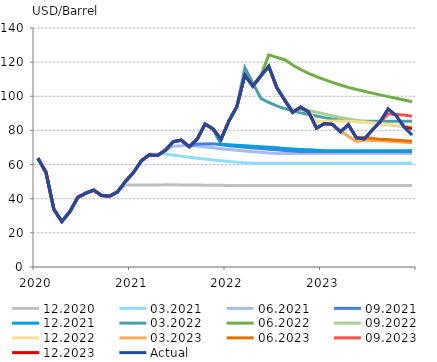
| Category | 12.2020 | 03.2021 | 06.2021 | 09.2021 | 12.2021 | 03.2022 | 06.2022 | 09.2022 | 12.2022 | 03.2023 | 06.2023 | 09.2023 | 12.2023 | Actual |
|---|---|---|---|---|---|---|---|---|---|---|---|---|---|---|
| 2020.0 | 63.673 | 63.673 | 63.673 | 63.673 | 63.673 | 63.673 | 63.673 | 63.673 | 63.673 | 63.673 | 63.673 | 63.673 | 63.673 | 63.673 |
| nan | 55.478 | 55.478 | 55.478 | 55.478 | 55.478 | 55.478 | 55.478 | 55.478 | 55.478 | 55.478 | 55.478 | 55.478 | 55.478 | 55.478 |
| nan | 33.729 | 33.729 | 33.729 | 33.729 | 33.729 | 33.729 | 33.729 | 33.729 | 33.729 | 33.729 | 33.729 | 33.729 | 33.729 | 33.729 |
| nan | 26.631 | 26.631 | 26.631 | 26.631 | 26.631 | 26.631 | 26.631 | 26.631 | 26.631 | 26.631 | 26.631 | 26.631 | 26.631 | 26.631 |
| nan | 32.412 | 32.412 | 32.412 | 32.412 | 32.412 | 32.412 | 32.412 | 32.412 | 32.412 | 32.412 | 32.412 | 32.412 | 32.412 | 32.412 |
| nan | 40.773 | 40.773 | 40.773 | 40.773 | 40.773 | 40.773 | 40.773 | 40.773 | 40.773 | 40.773 | 40.773 | 40.773 | 40.773 | 40.773 |
| nan | 43.222 | 43.222 | 43.222 | 43.222 | 43.222 | 43.222 | 43.222 | 43.222 | 43.222 | 43.222 | 43.222 | 43.222 | 43.222 | 43.222 |
| nan | 45.02 | 45.02 | 45.02 | 45.02 | 45.02 | 45.02 | 45.02 | 45.02 | 45.02 | 45.02 | 45.02 | 45.02 | 45.02 | 45.02 |
| nan | 41.874 | 41.874 | 41.874 | 41.874 | 41.874 | 41.874 | 41.874 | 41.874 | 41.874 | 41.874 | 41.874 | 41.874 | 41.874 | 41.874 |
| nan | 41.524 | 41.524 | 41.524 | 41.524 | 41.524 | 41.524 | 41.524 | 41.524 | 41.524 | 41.524 | 41.524 | 41.524 | 41.524 | 41.524 |
| nan | 43.98 | 43.98 | 43.98 | 43.98 | 43.98 | 43.98 | 43.98 | 43.98 | 43.98 | 43.98 | 43.98 | 43.98 | 43.98 | 43.98 |
| nan | 48.098 | 50.218 | 50.218 | 50.218 | 50.218 | 50.218 | 50.218 | 50.218 | 50.218 | 50.218 | 50.218 | 50.218 | 50.218 | 50.218 |
| 2021.0 | 48.1 | 55.322 | 55.322 | 55.322 | 55.322 | 55.322 | 55.322 | 55.322 | 55.322 | 55.322 | 55.322 | 55.322 | 55.322 | 55.322 |
| nan | 48.102 | 62.282 | 62.282 | 62.282 | 62.282 | 62.282 | 62.282 | 62.282 | 62.282 | 62.282 | 62.282 | 62.282 | 62.282 | 62.282 |
| nan | 48.09 | 66.056 | 65.702 | 65.702 | 65.702 | 65.702 | 65.702 | 65.702 | 65.702 | 65.702 | 65.702 | 65.702 | 65.702 | 65.702 |
| nan | 48.102 | 66.139 | 65.329 | 65.329 | 65.329 | 65.329 | 65.329 | 65.329 | 65.329 | 65.329 | 65.329 | 65.329 | 65.329 | 65.329 |
| nan | 48.126 | 66.222 | 68.309 | 68.309 | 68.309 | 68.309 | 68.309 | 68.309 | 68.309 | 68.309 | 68.309 | 68.309 | 68.309 | 68.309 |
| nan | 48.126 | 65.666 | 70.737 | 73.408 | 73.408 | 73.408 | 73.408 | 73.408 | 73.408 | 73.408 | 73.408 | 73.408 | 73.408 | 73.408 |
| nan | 48.07 | 64.952 | 70.997 | 74.294 | 74.294 | 74.294 | 74.294 | 74.294 | 74.294 | 74.294 | 74.294 | 74.294 | 74.294 | 74.294 |
| nan | 48.036 | 64.34 | 71.258 | 70.514 | 70.514 | 70.514 | 70.514 | 70.514 | 70.514 | 70.514 | 70.514 | 70.514 | 70.514 | 70.514 |
| nan | 47.988 | 63.76 | 70.858 | 72.028 | 74.876 | 74.876 | 74.876 | 74.876 | 74.876 | 74.876 | 74.876 | 74.876 | 74.876 | 74.876 |
| nan | 47.936 | 63.216 | 70.314 | 72.123 | 83.746 | 83.746 | 83.746 | 83.746 | 83.746 | 83.746 | 83.746 | 83.746 | 83.746 | 83.746 |
| nan | 47.878 | 62.716 | 69.792 | 72.218 | 80.85 | 80.85 | 80.85 | 80.85 | 80.85 | 80.85 | 80.85 | 80.85 | 80.85 | 80.85 |
| nan | 47.828 | 62.258 | 69.278 | 71.59 | 71.85 | 74.804 | 74.804 | 74.804 | 74.804 | 74.804 | 74.804 | 74.804 | 74.804 | 74.804 |
| 2022.0 | 47.792 | 61.83 | 68.804 | 71.03 | 71.619 | 85.572 | 85.572 | 85.572 | 85.572 | 85.572 | 85.572 | 85.572 | 85.572 | 85.572 |
| nan | 47.792 | 61.436 | 68.354 | 70.542 | 71.388 | 94.101 | 94.101 | 94.101 | 94.101 | 94.101 | 94.101 | 94.101 | 94.101 | 94.101 |
| nan | 47.792 | 61.072 | 67.938 | 70.112 | 71.038 | 116.747 | 112.463 | 112.463 | 112.463 | 112.463 | 112.463 | 112.463 | 112.463 | 112.463 |
| nan | 47.792 | 60.734 | 67.554 | 69.722 | 70.706 | 107.761 | 105.917 | 105.917 | 105.917 | 105.917 | 105.917 | 105.917 | 105.917 | 105.917 |
| nan | 47.792 | 60.734 | 67.198 | 69.348 | 70.418 | 98.775 | 111.96 | 111.96 | 111.96 | 111.96 | 111.96 | 111.96 | 111.96 | 111.96 |
| nan | 47.792 | 60.734 | 66.844 | 68.98 | 70.118 | 96.38 | 124.243 | 117.503 | 117.503 | 117.503 | 117.503 | 117.503 | 117.503 | 117.503 |
| nan | 47.792 | 60.734 | 66.518 | 68.622 | 69.794 | 94.415 | 122.825 | 105.124 | 105.124 | 105.124 | 105.124 | 105.124 | 105.124 | 105.124 |
| nan | 47.792 | 60.734 | 66.518 | 68.276 | 69.486 | 92.815 | 121.406 | 97.741 | 97.741 | 97.741 | 97.741 | 97.741 | 97.741 | 97.741 |
| nan | 47.792 | 60.734 | 66.518 | 67.936 | 69.176 | 91.485 | 118.328 | 92.145 | 90.571 | 90.571 | 90.571 | 90.571 | 90.571 | 90.571 |
| nan | 47.792 | 60.734 | 66.518 | 67.596 | 68.874 | 90.365 | 115.666 | 91.929 | 93.594 | 93.594 | 93.594 | 93.594 | 93.594 | 93.594 |
| nan | 47.792 | 60.734 | 66.518 | 67.596 | 68.612 | 89.365 | 113.478 | 91.712 | 90.852 | 90.852 | 90.852 | 90.852 | 90.852 | 90.852 |
| nan | 47.792 | 60.734 | 66.518 | 67.596 | 68.336 | 88.43 | 111.558 | 90.708 | 85.11 | 81.341 | 81.341 | 81.341 | 81.341 | 81.341 |
| 2023.0 | 47.792 | 60.734 | 66.518 | 67.596 | 68.05 | 87.505 | 109.764 | 89.588 | 85.311 | 83.998 | 83.998 | 83.998 | 83.998 | 83.998 |
| nan | 47.792 | 60.734 | 66.518 | 67.596 | 68.05 | 86.69 | 108.12 | 88.522 | 85.512 | 83.538 | 83.538 | 83.538 | 83.538 | 83.538 |
| nan | 47.792 | 60.734 | 66.518 | 67.596 | 68.05 | 86.055 | 106.636 | 87.548 | 85.476 | 79.742 | 79.207 | 79.207 | 79.207 | 79.207 |
| nan | 47.792 | 60.734 | 66.518 | 67.596 | 68.05 | 85.44 | 105.246 | 86.684 | 85.298 | 76.552 | 83.369 | 83.369 | 83.369 | 83.369 |
| nan | 47.792 | 60.734 | 66.518 | 67.596 | 68.05 | 85.44 | 104.028 | 85.916 | 85.052 | 73.362 | 75.695 | 75.695 | 75.695 | 75.695 |
| nan | 47.792 | 60.734 | 66.518 | 67.596 | 68.05 | 85.44 | 102.948 | 85.2 | 84.676 | 74.335 | 75.917 | 74.979 | 74.979 | 74.979 |
| nan | 47.792 | 60.734 | 66.518 | 67.596 | 68.05 | 85.44 | 101.862 | 84.588 | 84.294 | 74.13 | 75.34 | 80.16 | 80.16 | 80.16 |
| nan | 47.792 | 60.734 | 66.518 | 67.596 | 68.05 | 85.44 | 100.822 | 83.956 | 83.894 | 73.882 | 74.764 | 85.104 | 85.104 | 85.104 |
| nan | 47.792 | 60.734 | 66.518 | 67.596 | 68.05 | 85.44 | 99.79 | 83.342 | 83.482 | 73.622 | 74.618 | 89.702 | 92.587 | 92.587 |
| nan | 47.792 | 60.734 | 66.518 | 67.596 | 68.05 | 85.44 | 98.81 | 82.758 | 83.07 | 73.345 | 74.296 | 89.353 | 88.704 | 88.704 |
| nan | 47.792 | 60.734 | 66.518 | 67.596 | 68.05 | 85.44 | 97.832 | 82.226 | 82.658 | 73.083 | 73.978 | 89.004 | 82.03 | 82.03 |
| nan | 47.792 | 60.734 | 66.518 | 67.596 | 68.05 | 85.44 | 96.826 | 81.666 | 82.258 | 72.825 | 73.66 | 88.298 | 81.05 | 77.324 |